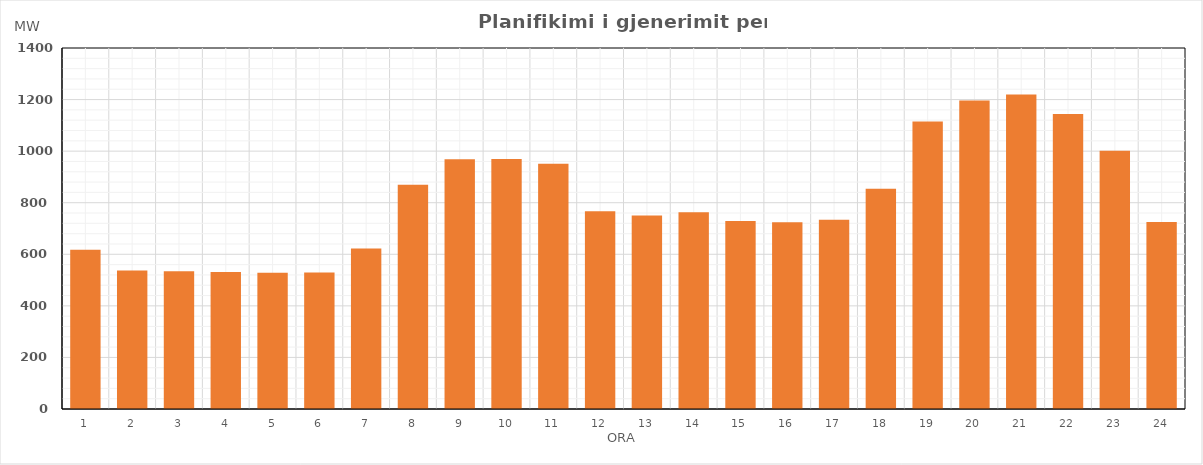
| Category | Max (MW) |
|---|---|
| 0 | 617.119 |
| 1 | 537.05 |
| 2 | 534.05 |
| 3 | 531.05 |
| 4 | 528.05 |
| 5 | 528.9 |
| 6 | 622.9 |
| 7 | 869.442 |
| 8 | 968.768 |
| 9 | 969.862 |
| 10 | 950.781 |
| 11 | 766.789 |
| 12 | 750.697 |
| 13 | 762.686 |
| 14 | 729.464 |
| 15 | 723.9 |
| 16 | 734.375 |
| 17 | 854.538 |
| 18 | 1115.02 |
| 19 | 1196.02 |
| 20 | 1220.02 |
| 21 | 1143.981 |
| 22 | 1001.516 |
| 23 | 724.836 |